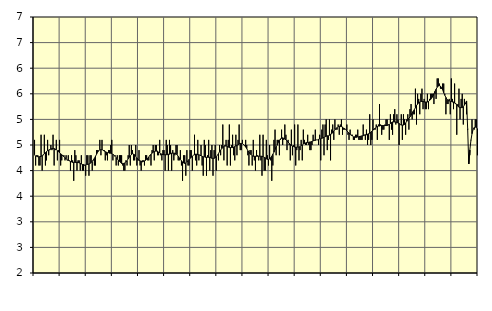
| Category | Personliga och kulturella tjänster, SNI 90-98 | Series 3 |
|---|---|---|
| nan | 4.6 | 4.31 |
| 87.0 | 4.1 | 4.28 |
| 87.0 | 4.3 | 4.28 |
| 87.0 | 4.3 | 4.27 |
| 87.0 | 4.1 | 4.27 |
| 87.0 | 4.1 | 4.27 |
| 87.0 | 4.7 | 4.28 |
| 87.0 | 4 | 4.29 |
| 87.0 | 4.3 | 4.31 |
| 87.0 | 4.7 | 4.33 |
| 87.0 | 4.1 | 4.35 |
| 87.0 | 4.2 | 4.37 |
| nan | 4.6 | 4.39 |
| 88.0 | 4.3 | 4.4 |
| 88.0 | 4.4 | 4.41 |
| 88.0 | 4.5 | 4.42 |
| 88.0 | 4.4 | 4.43 |
| 88.0 | 4.7 | 4.43 |
| 88.0 | 4.1 | 4.43 |
| 88.0 | 4.4 | 4.42 |
| 88.0 | 4.6 | 4.41 |
| 88.0 | 4.2 | 4.39 |
| 88.0 | 4.4 | 4.37 |
| 88.0 | 4.6 | 4.35 |
| nan | 4.1 | 4.33 |
| 89.0 | 4.2 | 4.31 |
| 89.0 | 4.3 | 4.29 |
| 89.0 | 4.3 | 4.27 |
| 89.0 | 4.2 | 4.25 |
| 89.0 | 4.3 | 4.23 |
| 89.0 | 4.2 | 4.21 |
| 89.0 | 4.3 | 4.2 |
| 89.0 | 4.2 | 4.19 |
| 89.0 | 4 | 4.18 |
| 89.0 | 4.3 | 4.17 |
| 89.0 | 4.2 | 4.16 |
| nan | 3.8 | 4.16 |
| 90.0 | 4.4 | 4.16 |
| 90.0 | 4.3 | 4.16 |
| 90.0 | 4 | 4.16 |
| 90.0 | 4.2 | 4.16 |
| 90.0 | 4.2 | 4.15 |
| 90.0 | 4 | 4.14 |
| 90.0 | 4.3 | 4.13 |
| 90.0 | 4 | 4.12 |
| 90.0 | 4 | 4.12 |
| 90.0 | 4.1 | 4.11 |
| 90.0 | 3.9 | 4.11 |
| nan | 4.3 | 4.12 |
| 91.0 | 4.3 | 4.12 |
| 91.0 | 3.9 | 4.13 |
| 91.0 | 4.3 | 4.14 |
| 91.0 | 4.3 | 4.16 |
| 91.0 | 4 | 4.18 |
| 91.0 | 4.2 | 4.21 |
| 91.0 | 4.1 | 4.24 |
| 91.0 | 4.1 | 4.28 |
| 91.0 | 4.4 | 4.32 |
| 91.0 | 4.4 | 4.36 |
| 91.0 | 4.4 | 4.39 |
| nan | 4.6 | 4.41 |
| 92.0 | 4.3 | 4.41 |
| 92.0 | 4.6 | 4.41 |
| 92.0 | 4.4 | 4.4 |
| 92.0 | 4.4 | 4.38 |
| 92.0 | 4.2 | 4.37 |
| 92.0 | 4.3 | 4.36 |
| 92.0 | 4.2 | 4.35 |
| 92.0 | 4.4 | 4.35 |
| 92.0 | 4.4 | 4.34 |
| 92.0 | 4.5 | 4.34 |
| 92.0 | 4.6 | 4.33 |
| nan | 4.2 | 4.32 |
| 93.0 | 4.3 | 4.3 |
| 93.0 | 4.3 | 4.28 |
| 93.0 | 4.1 | 4.25 |
| 93.0 | 4.3 | 4.23 |
| 93.0 | 4.1 | 4.2 |
| 93.0 | 4.3 | 4.18 |
| 93.0 | 4.3 | 4.16 |
| 93.0 | 4.3 | 4.14 |
| 93.0 | 4.1 | 4.14 |
| 93.0 | 4 | 4.14 |
| 93.0 | 4 | 4.15 |
| nan | 4.2 | 4.17 |
| 94.0 | 4.1 | 4.19 |
| 94.0 | 4.3 | 4.23 |
| 94.0 | 4.5 | 4.26 |
| 94.0 | 4.1 | 4.29 |
| 94.0 | 4.5 | 4.31 |
| 94.0 | 4.4 | 4.33 |
| 94.0 | 4.2 | 4.32 |
| 94.0 | 4.2 | 4.31 |
| 94.0 | 4.5 | 4.28 |
| 94.0 | 4.1 | 4.25 |
| 94.0 | 4.2 | 4.22 |
| nan | 4.4 | 4.2 |
| 95.0 | 4.1 | 4.19 |
| 95.0 | 4 | 4.18 |
| 95.0 | 4.2 | 4.17 |
| 95.0 | 4.2 | 4.18 |
| 95.0 | 4.1 | 4.19 |
| 95.0 | 4.3 | 4.2 |
| 95.0 | 4.3 | 4.22 |
| 95.0 | 4.2 | 4.24 |
| 95.0 | 4.2 | 4.27 |
| 95.0 | 4.3 | 4.29 |
| 95.0 | 4.1 | 4.32 |
| nan | 4.4 | 4.34 |
| 96.0 | 4.5 | 4.36 |
| 96.0 | 4.2 | 4.37 |
| 96.0 | 4.5 | 4.38 |
| 96.0 | 4.5 | 4.38 |
| 96.0 | 4.3 | 4.38 |
| 96.0 | 4.3 | 4.36 |
| 96.0 | 4.6 | 4.35 |
| 96.0 | 4.3 | 4.33 |
| 96.0 | 4.2 | 4.32 |
| 96.0 | 4.4 | 4.31 |
| 96.0 | 4.4 | 4.31 |
| nan | 4 | 4.31 |
| 97.0 | 4.6 | 4.31 |
| 97.0 | 4.5 | 4.31 |
| 97.0 | 4 | 4.32 |
| 97.0 | 4.6 | 4.32 |
| 97.0 | 4.5 | 4.33 |
| 97.0 | 4 | 4.34 |
| 97.0 | 4.4 | 4.34 |
| 97.0 | 4.2 | 4.34 |
| 97.0 | 4.3 | 4.34 |
| 97.0 | 4.5 | 4.33 |
| 97.0 | 4.5 | 4.31 |
| nan | 4.2 | 4.28 |
| 98.0 | 4.2 | 4.25 |
| 98.0 | 4.4 | 4.22 |
| 98.0 | 4.1 | 4.19 |
| 98.0 | 3.8 | 4.17 |
| 98.0 | 4.3 | 4.15 |
| 98.0 | 4.3 | 4.14 |
| 98.0 | 3.9 | 4.15 |
| 98.0 | 4.4 | 4.17 |
| 98.0 | 4.1 | 4.19 |
| 98.0 | 4.1 | 4.22 |
| 98.0 | 4.4 | 4.24 |
| nan | 4.4 | 4.26 |
| 99.0 | 4 | 4.28 |
| 99.0 | 4.3 | 4.3 |
| 99.0 | 4.7 | 4.31 |
| 99.0 | 4.2 | 4.32 |
| 99.0 | 4.1 | 4.32 |
| 99.0 | 4.6 | 4.31 |
| 99.0 | 4.2 | 4.31 |
| 99.0 | 4.3 | 4.3 |
| 99.0 | 4.5 | 4.29 |
| 99.0 | 4.1 | 4.28 |
| 99.0 | 3.9 | 4.27 |
| nan | 4.6 | 4.27 |
| 0.0 | 4.5 | 4.26 |
| 0.0 | 3.9 | 4.26 |
| 0.0 | 4.3 | 4.26 |
| 0.0 | 4.6 | 4.26 |
| 0.0 | 4 | 4.26 |
| 0.0 | 4.4 | 4.25 |
| 0.0 | 4.5 | 4.24 |
| 0.0 | 3.9 | 4.24 |
| 0.0 | 4.4 | 4.24 |
| 0.0 | 4.5 | 4.25 |
| 0.0 | 4 | 4.27 |
| nan | 4.3 | 4.3 |
| 1.0 | 4.2 | 4.33 |
| 1.0 | 4.5 | 4.37 |
| 1.0 | 4.3 | 4.4 |
| 1.0 | 4.5 | 4.43 |
| 1.0 | 4.9 | 4.45 |
| 1.0 | 4.2 | 4.47 |
| 1.0 | 4.5 | 4.48 |
| 1.0 | 4.6 | 4.48 |
| 1.0 | 4.1 | 4.47 |
| 1.0 | 4.6 | 4.46 |
| 1.0 | 4.9 | 4.45 |
| nan | 4.1 | 4.45 |
| 2.0 | 4.5 | 4.45 |
| 2.0 | 4.7 | 4.45 |
| 2.0 | 4.3 | 4.46 |
| 2.0 | 4.2 | 4.47 |
| 2.0 | 4.7 | 4.48 |
| 2.0 | 4.3 | 4.49 |
| 2.0 | 4.6 | 4.5 |
| 2.0 | 4.9 | 4.52 |
| 2.0 | 4.4 | 4.53 |
| 2.0 | 4.4 | 4.53 |
| 2.0 | 4.6 | 4.53 |
| nan | 4.5 | 4.51 |
| 3.0 | 4.5 | 4.49 |
| 3.0 | 4.6 | 4.46 |
| 3.0 | 4.5 | 4.43 |
| 3.0 | 4.3 | 4.39 |
| 3.0 | 4.1 | 4.36 |
| 3.0 | 4.4 | 4.33 |
| 3.0 | 4.4 | 4.31 |
| 3.0 | 4.1 | 4.29 |
| 3.0 | 4.6 | 4.28 |
| 3.0 | 4.2 | 4.28 |
| 3.0 | 4 | 4.28 |
| nan | 4.4 | 4.28 |
| 4.0 | 4.3 | 4.28 |
| 4.0 | 4.2 | 4.28 |
| 4.0 | 4.7 | 4.28 |
| 4.0 | 4.2 | 4.28 |
| 4.0 | 3.9 | 4.28 |
| 4.0 | 4.7 | 4.27 |
| 4.0 | 4 | 4.26 |
| 4.0 | 4 | 4.25 |
| 4.0 | 4.6 | 4.23 |
| 4.0 | 4.3 | 4.22 |
| 4.0 | 4.1 | 4.22 |
| nan | 4.5 | 4.23 |
| 5.0 | 4.2 | 4.25 |
| 5.0 | 3.8 | 4.28 |
| 5.0 | 4.1 | 4.32 |
| 5.0 | 4.6 | 4.36 |
| 5.0 | 4.8 | 4.41 |
| 5.0 | 4.3 | 4.46 |
| 5.0 | 4.6 | 4.5 |
| 5.0 | 4.6 | 4.55 |
| 5.0 | 4.3 | 4.59 |
| 5.0 | 4.6 | 4.62 |
| 5.0 | 4.8 | 4.63 |
| nan | 4.5 | 4.64 |
| 6.0 | 4.6 | 4.63 |
| 6.0 | 4.9 | 4.62 |
| 6.0 | 4.7 | 4.6 |
| 6.0 | 4.4 | 4.58 |
| 6.0 | 4.6 | 4.56 |
| 6.0 | 4.5 | 4.53 |
| 6.0 | 4.2 | 4.51 |
| 6.0 | 4.8 | 4.49 |
| 6.0 | 4.3 | 4.48 |
| 6.0 | 4.5 | 4.47 |
| 6.0 | 4.9 | 4.46 |
| nan | 4.1 | 4.46 |
| 7.0 | 4.4 | 4.46 |
| 7.0 | 4.9 | 4.46 |
| 7.0 | 4.2 | 4.46 |
| 7.0 | 4.4 | 4.47 |
| 7.0 | 4.6 | 4.49 |
| 7.0 | 4.2 | 4.5 |
| 7.0 | 4.8 | 4.52 |
| 7.0 | 4.6 | 4.53 |
| 7.0 | 4.5 | 4.54 |
| 7.0 | 4.5 | 4.55 |
| 7.0 | 4.7 | 4.55 |
| nan | 4.5 | 4.55 |
| 8.0 | 4.4 | 4.56 |
| 8.0 | 4.4 | 4.56 |
| 8.0 | 4.5 | 4.57 |
| 8.0 | 4.7 | 4.58 |
| 8.0 | 4.6 | 4.59 |
| 8.0 | 4.8 | 4.59 |
| 8.0 | 4.6 | 4.6 |
| 8.0 | 4.6 | 4.6 |
| 8.0 | 4.5 | 4.61 |
| 8.0 | 4.7 | 4.62 |
| 8.0 | 4.2 | 4.62 |
| nan | 4.8 | 4.63 |
| 9.0 | 4.9 | 4.64 |
| 9.0 | 4.3 | 4.65 |
| 9.0 | 4.9 | 4.66 |
| 9.0 | 5 | 4.67 |
| 9.0 | 4.4 | 4.68 |
| 9.0 | 4.6 | 4.68 |
| 9.0 | 5 | 4.69 |
| 9.0 | 4.2 | 4.71 |
| 9.0 | 4.8 | 4.72 |
| 9.0 | 4.9 | 4.74 |
| 9.0 | 4.6 | 4.77 |
| nan | 5 | 4.8 |
| 10.0 | 4.8 | 4.82 |
| 10.0 | 4.8 | 4.84 |
| 10.0 | 4.9 | 4.86 |
| 10.0 | 4.7 | 4.86 |
| 10.0 | 4.9 | 4.86 |
| 10.0 | 5 | 4.86 |
| 10.0 | 4.7 | 4.85 |
| 10.0 | 4.8 | 4.83 |
| 10.0 | 4.8 | 4.82 |
| 10.0 | 4.8 | 4.8 |
| 10.0 | 4.9 | 4.78 |
| nan | 4.7 | 4.75 |
| 11.0 | 4.6 | 4.73 |
| 11.0 | 4.8 | 4.71 |
| 11.0 | 4.7 | 4.69 |
| 11.0 | 4.7 | 4.68 |
| 11.0 | 4.6 | 4.66 |
| 11.0 | 4.6 | 4.66 |
| 11.0 | 4.7 | 4.65 |
| 11.0 | 4.7 | 4.65 |
| 11.0 | 4.8 | 4.66 |
| 11.0 | 4.6 | 4.66 |
| 11.0 | 4.6 | 4.67 |
| nan | 4.6 | 4.67 |
| 12.0 | 4.6 | 4.68 |
| 12.0 | 4.9 | 4.68 |
| 12.0 | 4.7 | 4.69 |
| 12.0 | 4.6 | 4.7 |
| 12.0 | 4.8 | 4.7 |
| 12.0 | 4.5 | 4.71 |
| 12.0 | 4.6 | 4.72 |
| 12.0 | 5.1 | 4.73 |
| 12.0 | 4.5 | 4.75 |
| 12.0 | 4.6 | 4.77 |
| 12.0 | 5 | 4.79 |
| nan | 4.8 | 4.81 |
| 13.0 | 4.8 | 4.83 |
| 13.0 | 4.9 | 4.85 |
| 13.0 | 4.6 | 4.86 |
| 13.0 | 4.9 | 4.87 |
| 13.0 | 5.3 | 4.87 |
| 13.0 | 4.9 | 4.88 |
| 13.0 | 4.7 | 4.88 |
| 13.0 | 4.8 | 4.88 |
| 13.0 | 4.8 | 4.88 |
| 13.0 | 4.9 | 4.88 |
| 13.0 | 5 | 4.88 |
| nan | 5 | 4.88 |
| 14.0 | 4.9 | 4.89 |
| 14.0 | 4.6 | 4.9 |
| 14.0 | 5.1 | 4.92 |
| 14.0 | 4.8 | 4.94 |
| 14.0 | 4.7 | 4.95 |
| 14.0 | 5.1 | 4.95 |
| 14.0 | 5.2 | 4.95 |
| 14.0 | 4.9 | 4.95 |
| 14.0 | 5.1 | 4.94 |
| 14.0 | 5 | 4.93 |
| 14.0 | 4.5 | 4.92 |
| nan | 4.9 | 4.9 |
| 15.0 | 5.1 | 4.89 |
| 15.0 | 4.6 | 4.89 |
| 15.0 | 5.1 | 4.89 |
| 15.0 | 5 | 4.9 |
| 15.0 | 4.7 | 4.93 |
| 15.0 | 5 | 4.96 |
| 15.0 | 5.1 | 4.99 |
| 15.0 | 4.8 | 5.02 |
| 15.0 | 5.2 | 5.05 |
| 15.0 | 5.3 | 5.08 |
| 15.0 | 5 | 5.12 |
| nan | 5.1 | 5.16 |
| 16.0 | 5.1 | 5.19 |
| 16.0 | 5.6 | 5.23 |
| 16.0 | 4.9 | 5.27 |
| 16.0 | 5.5 | 5.3 |
| 16.0 | 5.4 | 5.32 |
| 16.0 | 5.1 | 5.34 |
| 16.0 | 5.5 | 5.35 |
| 16.0 | 5.6 | 5.35 |
| 16.0 | 5.2 | 5.35 |
| 16.0 | 5.4 | 5.34 |
| 16.0 | 5.2 | 5.34 |
| nan | 5.2 | 5.34 |
| 17.0 | 5.5 | 5.34 |
| 17.0 | 5.2 | 5.35 |
| 17.0 | 5.4 | 5.37 |
| 17.0 | 5.5 | 5.39 |
| 17.0 | 5.5 | 5.42 |
| 17.0 | 5.5 | 5.46 |
| 17.0 | 5.3 | 5.5 |
| 17.0 | 5.5 | 5.55 |
| 17.0 | 5.4 | 5.59 |
| 17.0 | 5.8 | 5.63 |
| 17.0 | 5.8 | 5.65 |
| nan | 5.7 | 5.66 |
| 18.0 | 5.6 | 5.65 |
| 18.0 | 5.6 | 5.62 |
| 18.0 | 5.7 | 5.58 |
| 18.0 | 5.7 | 5.52 |
| 18.0 | 5.5 | 5.47 |
| 18.0 | 5.1 | 5.43 |
| 18.0 | 5.3 | 5.39 |
| 18.0 | 5.3 | 5.37 |
| 18.0 | 5.4 | 5.36 |
| 18.0 | 5.1 | 5.35 |
| 18.0 | 5.8 | 5.35 |
| nan | 5.4 | 5.34 |
| 19.0 | 5.2 | 5.34 |
| 19.0 | 5.7 | 5.32 |
| 19.0 | 5.3 | 5.31 |
| 19.0 | 4.7 | 5.28 |
| 19.0 | 5.3 | 5.26 |
| 19.0 | 5.6 | 5.24 |
| 19.0 | 5 | 5.23 |
| 19.0 | 5.4 | 5.23 |
| 19.0 | 5.5 | 5.23 |
| 19.0 | 4.9 | 5.25 |
| 19.0 | 5.4 | 5.28 |
| nan | 5.3 | 5.32 |
| 20.0 | 5.1 | 5.36 |
| 20.0 | 4.8 | 4.82 |
| 20.0 | 4.3 | 4.13 |
| 20.0 | 4.3 | 4.4 |
| 20.0 | 4.6 | 4.59 |
| 20.0 | 5 | 4.72 |
| 20.0 | 4.8 | 4.8 |
| 20.0 | 4.8 | 4.84 |
| 20.0 | 5 | 4.85 |
| 20.0 | 5 | 4.84 |
| 20.0 | 4.3 | 4.82 |